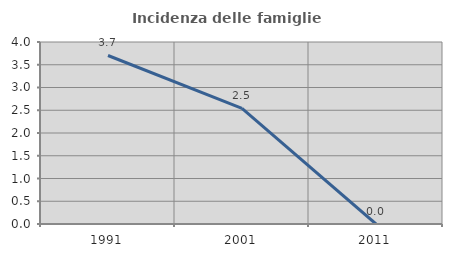
| Category | Incidenza delle famiglie numerose |
|---|---|
| 1991.0 | 3.704 |
| 2001.0 | 2.542 |
| 2011.0 | 0 |